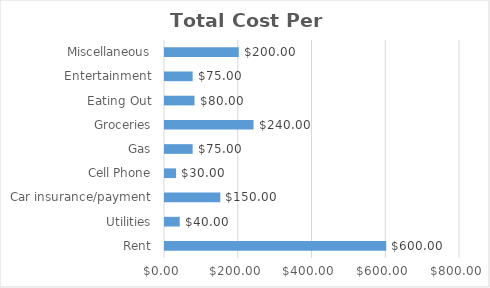
| Category | Series 0 |
|---|---|
| Rent | 600 |
| Utilities | 40 |
| Car insurance/payment | 150 |
| Cell Phone | 30 |
| Gas | 75 |
| Groceries | 240 |
| Eating Out | 80 |
| Entertainment | 75 |
| Miscellaneous | 200 |